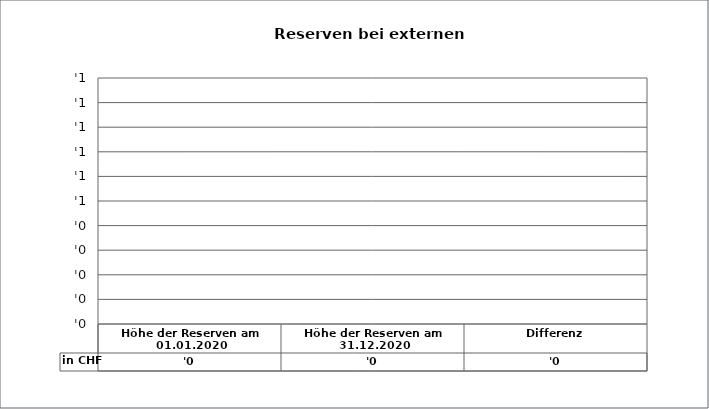
| Category | in CHF |
|---|---|
| Höhe der Reserven am 01.01.2020 | 0 |
| Höhe der Reserven am 31.12.2020 | 0 |
| Differenz | 0 |